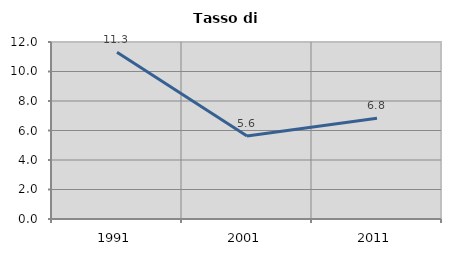
| Category | Tasso di disoccupazione   |
|---|---|
| 1991.0 | 11.304 |
| 2001.0 | 5.622 |
| 2011.0 | 6.827 |